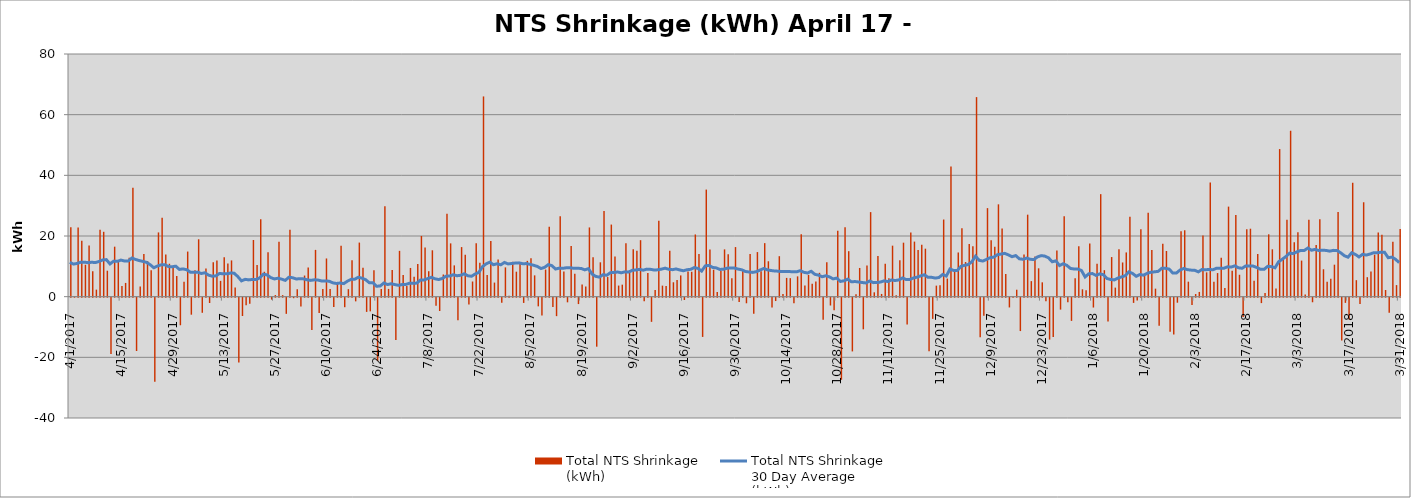
| Category | Total NTS Shrinkage
(kWh) |
|---|---|
| 4/1/17 | 22899211 |
| 4/2/17 | 31571 |
| 4/3/17 | 22828345 |
| 4/4/17 | 18425044 |
| 4/5/17 | 10522589 |
| 4/6/17 | 16871159 |
| 4/7/17 | 8370533 |
| 4/8/17 | 2317661 |
| 4/9/17 | 22088375 |
| 4/10/17 | 21384780 |
| 4/11/17 | 8561859 |
| 4/12/17 | -18567308 |
| 4/13/17 | 16483180 |
| 4/14/17 | 11553594 |
| 4/15/17 | 3481130 |
| 4/16/17 | 4533171 |
| 4/17/17 | 12822129 |
| 4/18/17 | 35867719 |
| 4/19/17 | -17578336 |
| 4/20/17 | 3348972 |
| 4/21/17 | 14102287 |
| 4/22/17 | 11722019 |
| 4/23/17 | 8715219 |
| 4/24/17 | -27752166 |
| 4/25/17 | 21179515 |
| 4/26/17 | 26007398 |
| 4/27/17 | 13905527 |
| 4/28/17 | 10853023 |
| 4/29/17 | 9789022 |
| 4/30/17 | 6830050 |
| 5/1/17 | -9097026 |
| 5/2/17 | 4910634 |
| 5/3/17 | 14871410 |
| 5/4/17 | -5611143 |
| 5/5/17 | 8714971 |
| 5/6/17 | 18920007 |
| 5/7/17 | -4984629 |
| 5/8/17 | 9303245 |
| 5/9/17 | -1756342 |
| 5/10/17 | 11345952 |
| 5/11/17 | 11882661 |
| 5/12/17 | 5202563 |
| 5/13/17 | 13001341 |
| 5/14/17 | 10920946 |
| 5/15/17 | 11953606 |
| 5/16/17 | 3000865 |
| 5/17/17 | -21412207 |
| 5/18/17 | -6044130 |
| 5/19/17 | -2516443 |
| 5/20/17 | -1986275 |
| 5/21/17 | 18673705 |
| 5/22/17 | 10428705 |
| 5/23/17 | 25526680 |
| 5/24/17 | 8207004 |
| 5/25/17 | 14620090 |
| 5/26/17 | -637089 |
| 5/27/17 | 523262 |
| 5/28/17 | 18130890 |
| 5/29/17 | 506692 |
| 5/30/17 | -5335309 |
| 5/31/17 | 22044772 |
| 6/1/17 | -177895 |
| 6/2/17 | 2454512 |
| 6/3/17 | -2891870 |
| 6/4/17 | 6962867 |
| 6/5/17 | 9646195 |
| 6/6/17 | -10692787 |
| 6/7/17 | 15426511 |
| 6/8/17 | -5042109 |
| 6/9/17 | 2535399 |
| 6/10/17 | 12594384 |
| 6/11/17 | 2541702 |
| 6/12/17 | -3098470 |
| 6/13/17 | 4503715 |
| 6/14/17 | 16817905 |
| 6/15/17 | -3146412 |
| 6/16/17 | 2472450 |
| 6/17/17 | 11986159 |
| 6/18/17 | -1218060 |
| 6/19/17 | 17832073 |
| 6/20/17 | 9529644 |
| 6/21/17 | -4692536 |
| 6/22/17 | -4517886 |
| 6/23/17 | 8713087 |
| 6/24/17 | -20828990 |
| 6/25/17 | 2486416 |
| 6/26/17 | 29834194 |
| 6/27/17 | 2555009 |
| 6/28/17 | 8831528 |
| 6/29/17 | -13945696 |
| 6/30/17 | 15104091 |
| 7/1/17 | 7162171 |
| 7/2/17 | 3494645 |
| 7/3/17 | 9463736 |
| 7/4/17 | 6580676 |
| 7/5/17 | 10736020 |
| 7/6/17 | 20013828 |
| 7/7/17 | 16226937 |
| 7/8/17 | 8388915 |
| 7/9/17 | 15291303 |
| 7/10/17 | -2666343 |
| 7/11/17 | -4397938 |
| 7/12/17 | 7309100 |
| 7/13/17 | 27366353 |
| 7/14/17 | 17567824 |
| 7/15/17 | 10315699 |
| 7/16/17 | -7461650 |
| 7/17/17 | 16348763 |
| 7/18/17 | 13812211 |
| 7/19/17 | -2225502 |
| 7/20/17 | 4998752 |
| 7/21/17 | 17582174 |
| 7/22/17 | 11154322 |
| 7/23/17 | 66012244 |
| 7/24/17 | 7136434 |
| 7/25/17 | 18383984 |
| 7/26/17 | 4643235 |
| 7/27/17 | 12255858 |
| 7/28/17 | -1676089 |
| 7/29/17 | 9652182 |
| 7/30/17 | 280558 |
| 7/31/17 | 11496016 |
| 8/1/17 | 8234154 |
| 8/2/17 | 10958989 |
| 8/3/17 | -1733560 |
| 8/4/17 | 11801093 |
| 8/5/17 | 12669606 |
| 8/6/17 | 7022285 |
| 8/7/17 | -2860414 |
| 8/8/17 | -5893028 |
| 8/9/17 | 8933801 |
| 8/10/17 | 23014635 |
| 8/11/17 | -3078922 |
| 8/12/17 | -6092177 |
| 8/13/17 | 26546048 |
| 8/14/17 | 8256224 |
| 8/15/17 | -1537245 |
| 8/16/17 | 16693633 |
| 8/17/17 | 7570737 |
| 8/18/17 | -2112967 |
| 8/19/17 | 4050860 |
| 8/20/17 | 3316100 |
| 8/21/17 | 22823733 |
| 8/22/17 | 13016768 |
| 8/23/17 | -16160138 |
| 8/24/17 | 11325567 |
| 8/25/17 | 28238165 |
| 8/26/17 | 6469487 |
| 8/27/17 | 23769093 |
| 8/28/17 | 13270878 |
| 8/29/17 | 3660470 |
| 8/30/17 | 3956339 |
| 8/31/17 | 17584341 |
| 9/1/17 | 8711956 |
| 9/2/17 | 15668522 |
| 9/3/17 | 15140090 |
| 9/4/17 | 18623650 |
| 9/5/17 | -1197529 |
| 9/6/17 | 7789300 |
| 9/7/17 | -7970834 |
| 9/8/17 | 2204736 |
| 9/9/17 | 25018955 |
| 9/10/17 | 3637427 |
| 9/11/17 | 3543433 |
| 9/12/17 | 15163996 |
| 9/13/17 | 4744732 |
| 9/14/17 | 5513837 |
| 9/15/17 | 7005735 |
| 9/16/17 | -777897 |
| 9/17/17 | 8259079 |
| 9/18/17 | 8210216 |
| 9/19/17 | 20506306 |
| 9/20/17 | 14099793 |
| 9/21/17 | -12941470 |
| 9/22/17 | 35301162 |
| 9/23/17 | 15554092 |
| 9/24/17 | 8891937 |
| 9/25/17 | 1550892 |
| 9/26/17 | 8553285 |
| 9/27/17 | 15590772 |
| 9/28/17 | 13980984 |
| 9/29/17 | 6071819 |
| 9/30/17 | 16350753 |
| 10/1/17 | -1413151 |
| 10/2/17 | 8695314 |
| 10/3/17 | -1850134 |
| 10/4/17 | 14052236 |
| 10/5/17 | -5282946 |
| 10/6/17 | 14701270 |
| 10/7/17 | 8370518 |
| 10/8/17 | 17649905 |
| 10/9/17 | 11669533 |
| 10/10/17 | -3232342 |
| 10/11/17 | -1114439 |
| 10/12/17 | 13344609 |
| 10/13/17 | 893000 |
| 10/14/17 | 6186434 |
| 10/15/17 | 6102686 |
| 10/16/17 | -1840577 |
| 10/17/17 | 6691637 |
| 10/18/17 | 20587692 |
| 10/19/17 | 3657202 |
| 10/20/17 | 7170886 |
| 10/21/17 | 4246605 |
| 10/22/17 | 5010752 |
| 10/23/17 | 7865291 |
| 10/24/17 | -7300204 |
| 10/25/17 | 11326076 |
| 10/26/17 | -2584512 |
| 10/27/17 | -4140897 |
| 10/28/17 | 21763006 |
| 10/29/17 | -27060230 |
| 10/30/17 | 22866636 |
| 10/31/17 | 14995051 |
| 11/1/17 | -17720301 |
| 11/2/17 | 799186 |
| 11/3/17 | 9462596 |
| 11/4/17 | -10434844 |
| 11/5/17 | 10259229 |
| 11/6/17 | 27875288 |
| 11/7/17 | 1437739 |
| 11/8/17 | 13388898 |
| 11/9/17 | 895461 |
| 11/10/17 | 10862103 |
| 11/11/17 | 6034390 |
| 11/12/17 | 16814394 |
| 11/13/17 | 507887 |
| 11/14/17 | 12026645 |
| 11/15/17 | 17798476 |
| 11/16/17 | -8862980 |
| 11/17/17 | 21155045 |
| 11/18/17 | 18153059 |
| 11/19/17 | 15405912 |
| 11/20/17 | 17074375 |
| 11/21/17 | 15822649 |
| 11/22/17 | -17656151 |
| 11/23/17 | -6989250 |
| 11/24/17 | 3636267 |
| 11/25/17 | 3773154 |
| 11/26/17 | 25434187 |
| 11/27/17 | 5971936 |
| 11/28/17 | 42908912 |
| 11/29/17 | 8594845 |
| 11/30/17 | 14568116 |
| 12/1/17 | 22571650 |
| 12/2/17 | 11416167 |
| 12/3/17 | 17327671 |
| 12/4/17 | 16643883 |
| 12/5/17 | 65786346 |
| 12/6/17 | -13010937 |
| 12/7/17 | -5937147 |
| 12/8/17 | 29189548 |
| 12/9/17 | 18564377 |
| 12/10/17 | 16493418 |
| 12/11/17 | 30441252 |
| 12/12/17 | 22509817 |
| 12/13/17 | 7436906 |
| 12/14/17 | -3224056 |
| 12/15/17 | 76382 |
| 12/16/17 | 2291804 |
| 12/17/17 | -11013071 |
| 12/18/17 | 13918869 |
| 12/19/17 | 27035502 |
| 12/20/17 | 5121324 |
| 12/21/17 | 13217479 |
| 12/22/17 | 9348393 |
| 12/23/17 | 4726950 |
| 12/24/17 | -1154185 |
| 12/25/17 | -13824626 |
| 12/26/17 | -12949911 |
| 12/27/17 | 15252536 |
| 12/28/17 | -3938289 |
| 12/29/17 | 26540245 |
| 12/30/17 | -1485635 |
| 12/31/17 | -7656364 |
| 1/1/18 | 6092275 |
| 1/2/18 | 16605931 |
| 1/3/18 | 2434947 |
| 1/4/18 | 2152706 |
| 1/5/18 | 17551021 |
| 1/6/18 | -3251707 |
| 1/7/18 | 10874256 |
| 1/8/18 | 33797113 |
| 1/9/18 | 8731069 |
| 1/10/18 | -7865515 |
| 1/11/18 | 13061351 |
| 1/12/18 | 2985014 |
| 1/13/18 | 15611844 |
| 1/14/18 | 11274936 |
| 1/15/18 | 14587413 |
| 1/16/18 | 26355626 |
| 1/17/18 | -1721968 |
| 1/18/18 | -909325 |
| 1/19/18 | 22238489 |
| 1/20/18 | 7214941 |
| 1/21/18 | 27691864 |
| 1/22/18 | 15399172 |
| 1/23/18 | 2642925 |
| 1/24/18 | -9241931 |
| 1/25/18 | 17443690 |
| 1/26/18 | 15053370 |
| 1/27/18 | -11264731 |
| 1/28/18 | -12140056 |
| 1/29/18 | -1664316 |
| 1/30/18 | 21551877 |
| 1/31/18 | 21892851 |
| 2/1/18 | 4947190 |
| 2/2/18 | -2448027 |
| 2/3/18 | 865561 |
| 2/4/18 | 1561777 |
| 2/5/18 | 20132709 |
| 2/6/18 | 8015694 |
| 2/7/18 | 37653043 |
| 2/8/18 | 4894467 |
| 2/9/18 | 7781499 |
| 2/10/18 | 12798664 |
| 2/11/18 | 2897013 |
| 2/12/18 | 29687127 |
| 2/13/18 | 8573872 |
| 2/14/18 | 26886285 |
| 2/15/18 | 7221939 |
| 2/16/18 | -6363680 |
| 2/17/18 | 22221788 |
| 2/18/18 | 22404318 |
| 2/19/18 | 5213726 |
| 2/20/18 | 14030163 |
| 2/21/18 | -1789661 |
| 2/22/18 | 1201423 |
| 2/23/18 | 20561669 |
| 2/24/18 | 15611459 |
| 2/25/18 | 2723266 |
| 2/26/18 | 48656133 |
| 2/27/18 | 12462217 |
| 2/28/18 | 25357373 |
| 3/1/18 | 54698757 |
| 3/2/18 | 17964383 |
| 3/3/18 | 21218065 |
| 3/4/18 | 11892788 |
| 3/5/18 | 713171 |
| 3/6/18 | 25348643 |
| 3/7/18 | -1514329 |
| 3/8/18 | 16992728 |
| 3/9/18 | 25491299 |
| 3/10/18 | 9039007 |
| 3/11/18 | 4934908 |
| 3/12/18 | 5941788 |
| 3/13/18 | 10545006 |
| 3/14/18 | 27946724 |
| 3/15/18 | -14161224 |
| 3/16/18 | -1713429 |
| 3/17/18 | -7187952 |
| 3/18/18 | 37552732 |
| 3/19/18 | 5439861 |
| 3/20/18 | -2111357 |
| 3/21/18 | 31125202 |
| 3/22/18 | 6425003 |
| 3/23/18 | 8324308 |
| 3/24/18 | 13851801 |
| 3/25/18 | 21180606 |
| 3/26/18 | 20415543 |
| 3/27/18 | 2204836 |
| 3/28/18 | -4942357 |
| 3/29/18 | 18101803 |
| 3/30/18 | 3814743 |
| 3/31/18 | 22340338 |